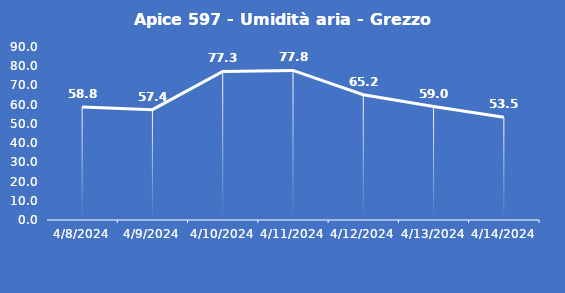
| Category | Apice 597 - Umidità aria - Grezzo (%) |
|---|---|
| 4/8/24 | 58.8 |
| 4/9/24 | 57.4 |
| 4/10/24 | 77.3 |
| 4/11/24 | 77.8 |
| 4/12/24 | 65.2 |
| 4/13/24 | 59 |
| 4/14/24 | 53.5 |